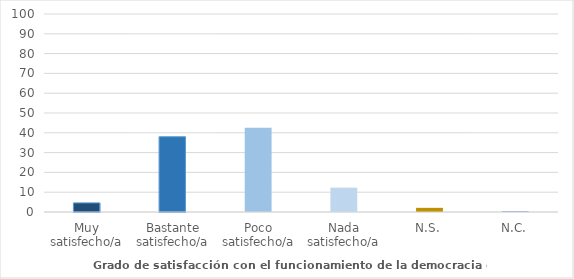
| Category | Series 0 |
|---|---|
| Muy satisfecho/a | 4.6 |
| Bastante satisfecho/a | 38 |
| Poco satisfecho/a | 42.5 |
| Nada satisfecho/a | 12.3 |
| N.S. | 2.1 |
| N.C. | 0.4 |